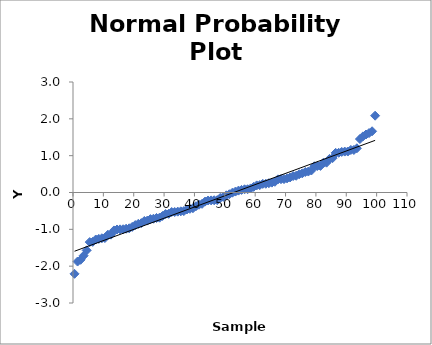
| Category | Series 0 |
|---|---|
| 0.5 | -2.208 |
| 1.5 | -1.875 |
| 2.5 | -1.827 |
| 3.5 | -1.716 |
| 4.5 | -1.571 |
| 5.5 | -1.346 |
| 6.5 | -1.34 |
| 7.5 | -1.276 |
| 8.5 | -1.26 |
| 9.5 | -1.243 |
| 10.5 | -1.237 |
| 11.5 | -1.147 |
| 12.5 | -1.144 |
| 13.5 | -1.03 |
| 14.5 | -1.004 |
| 15.5 | -1.001 |
| 16.5 | -0.998 |
| 17.5 | -0.983 |
| 18.5 | -0.972 |
| 19.5 | -0.934 |
| 20.5 | -0.885 |
| 21.5 | -0.851 |
| 22.5 | -0.831 |
| 23.5 | -0.773 |
| 24.5 | -0.762 |
| 25.5 | -0.722 |
| 26.5 | -0.713 |
| 27.5 | -0.691 |
| 28.5 | -0.684 |
| 29.5 | -0.637 |
| 30.5 | -0.584 |
| 31.5 | -0.579 |
| 32.5 | -0.53 |
| 33.5 | -0.529 |
| 34.5 | -0.52 |
| 35.5 | -0.511 |
| 36.5 | -0.505 |
| 37.5 | -0.462 |
| 38.5 | -0.443 |
| 39.5 | -0.427 |
| 40.5 | -0.373 |
| 41.5 | -0.332 |
| 42.5 | -0.307 |
| 43.5 | -0.247 |
| 44.5 | -0.217 |
| 45.5 | -0.215 |
| 46.5 | -0.21 |
| 47.5 | -0.208 |
| 48.5 | -0.148 |
| 49.5 | -0.12 |
| 50.5 | -0.077 |
| 51.5 | -0.047 |
| 52.5 | -0.005 |
| 53.5 | 0.025 |
| 54.5 | 0.052 |
| 55.5 | 0.07 |
| 56.5 | 0.087 |
| 57.5 | 0.089 |
| 58.5 | 0.111 |
| 59.5 | 0.153 |
| 60.5 | 0.193 |
| 61.5 | 0.201 |
| 62.5 | 0.234 |
| 63.5 | 0.237 |
| 64.5 | 0.252 |
| 65.5 | 0.268 |
| 66.5 | 0.291 |
| 67.5 | 0.357 |
| 68.5 | 0.361 |
| 69.5 | 0.364 |
| 70.5 | 0.384 |
| 71.5 | 0.409 |
| 72.5 | 0.446 |
| 73.5 | 0.455 |
| 74.5 | 0.496 |
| 75.5 | 0.52 |
| 76.5 | 0.556 |
| 77.5 | 0.569 |
| 78.5 | 0.597 |
| 79.5 | 0.712 |
| 80.5 | 0.721 |
| 81.5 | 0.722 |
| 82.5 | 0.809 |
| 83.5 | 0.81 |
| 84.5 | 0.914 |
| 85.5 | 0.933 |
| 86.5 | 1.076 |
| 87.5 | 1.078 |
| 88.5 | 1.101 |
| 89.5 | 1.111 |
| 90.5 | 1.112 |
| 91.5 | 1.155 |
| 92.5 | 1.155 |
| 93.5 | 1.2 |
| 94.5 | 1.452 |
| 95.5 | 1.524 |
| 96.5 | 1.575 |
| 97.5 | 1.614 |
| 98.5 | 1.662 |
| 99.5 | 2.085 |